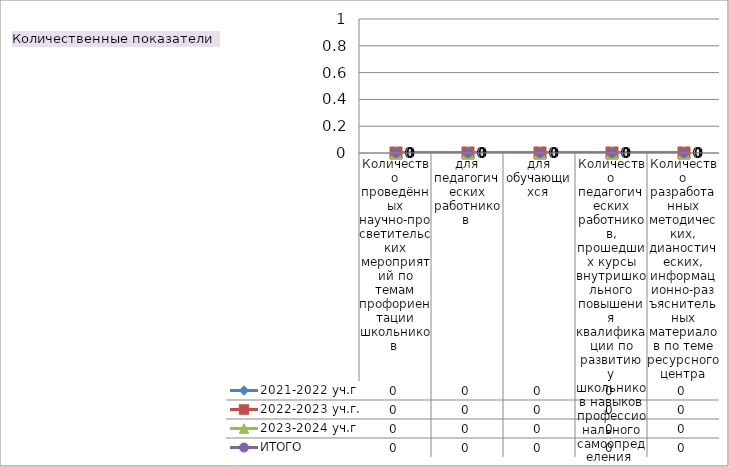
| Category | 2021-2022 уч.г | 2022-2023 уч.г. | 2023-2024 уч.г | ИТОГО |
|---|---|---|---|---|
| Количество проведённых научно-просветительских мероприятий по темам профориентации школьников  | 0 | 0 | 0 | 0 |
| для педагогических работников  | 0 | 0 | 0 | 0 |
| для обучающихся  | 0 | 0 | 0 | 0 |
| Количество педагогических работников, прошедших курсы внутришкольного повышения квалификации по развитию у школьников навыков профессионального самоопределения  | 0 | 0 | 0 | 0 |
| Количество разработанных методических, дианостических, информационно-разъяснительных материалов по теме ресурсного центра | 0 | 0 | 0 | 0 |